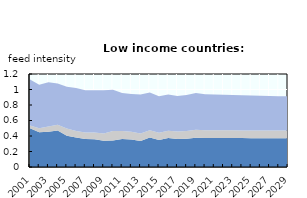
| Category | High protein feed | Medium protein feed | Low protein feed |
|---|---|---|---|
| 2001.0 | 0.5 | 0.036 | 0.595 |
| 2002.0 | 0.449 | 0.05 | 0.563 |
| 2003.0 | 0.456 | 0.065 | 0.574 |
| 2004.0 | 0.472 | 0.074 | 0.532 |
| 2005.0 | 0.403 | 0.094 | 0.538 |
| 2006.0 | 0.382 | 0.082 | 0.554 |
| 2007.0 | 0.36 | 0.086 | 0.545 |
| 2008.0 | 0.359 | 0.087 | 0.544 |
| 2009.0 | 0.337 | 0.096 | 0.556 |
| 2010.0 | 0.341 | 0.122 | 0.534 |
| 2011.0 | 0.362 | 0.102 | 0.493 |
| 2012.0 | 0.354 | 0.101 | 0.485 |
| 2013.0 | 0.336 | 0.097 | 0.504 |
| 2014.0 | 0.381 | 0.094 | 0.486 |
| 2015.0 | 0.348 | 0.093 | 0.472 |
| 2016.0 | 0.373 | 0.095 | 0.466 |
| 2017.0 | 0.361 | 0.097 | 0.458 |
| 2018.0 | 0.366 | 0.099 | 0.466 |
| 2019.0 | 0.379 | 0.102 | 0.475 |
| 2020.0 | 0.375 | 0.1 | 0.464 |
| 2021.0 | 0.375 | 0.1 | 0.461 |
| 2022.0 | 0.374 | 0.1 | 0.458 |
| 2023.0 | 0.374 | 0.1 | 0.455 |
| 2024.0 | 0.373 | 0.099 | 0.452 |
| 2025.0 | 0.373 | 0.099 | 0.449 |
| 2026.0 | 0.372 | 0.1 | 0.447 |
| 2027.0 | 0.372 | 0.1 | 0.445 |
| 2028.0 | 0.372 | 0.1 | 0.442 |
| 2029.0 | 0.372 | 0.1 | 0.441 |